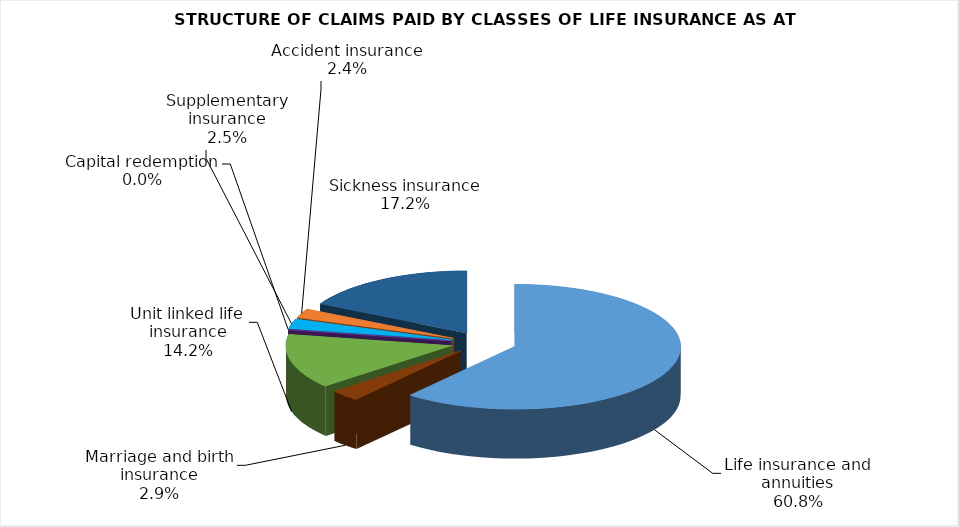
| Category | Life insurance and annuities |
|---|---|
| Life insurance and annuities | 79720046.478 |
| Marriage and birth insurance | 3847336.4 |
| Unit linked life insurance | 18570547.816 |
| Capital redemption | 0 |
| Supplementary insurance | 3281207.754 |
| Accident insurance | 3093154.485 |
| Sickness insurance | 22593817.59 |